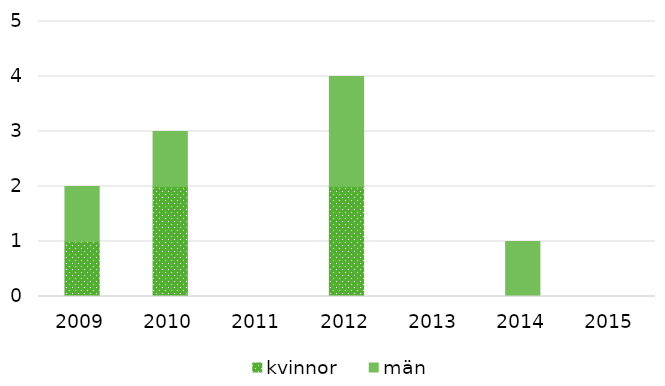
| Category | kvinnor | män |
|---|---|---|
| 2009.0 | 1 | 1 |
| 2010.0 | 2 | 1 |
| 2011.0 | 0 | 0 |
| 2012.0 | 2 | 2 |
| 2013.0 | 0 | 0 |
| 2014.0 | 0 | 1 |
| 2015.0 | 0 | 0 |